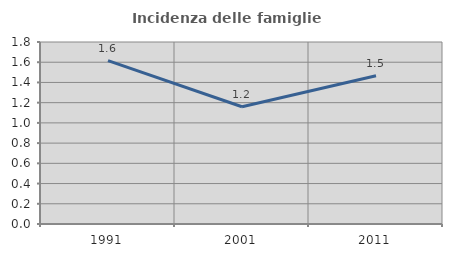
| Category | Incidenza delle famiglie numerose |
|---|---|
| 1991.0 | 1.616 |
| 2001.0 | 1.16 |
| 2011.0 | 1.465 |